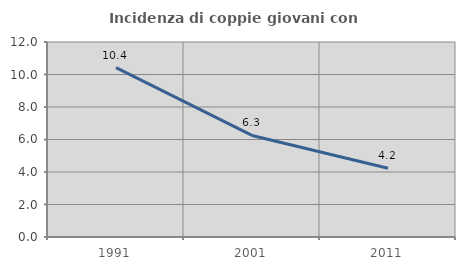
| Category | Incidenza di coppie giovani con figli |
|---|---|
| 1991.0 | 10.425 |
| 2001.0 | 6.251 |
| 2011.0 | 4.227 |